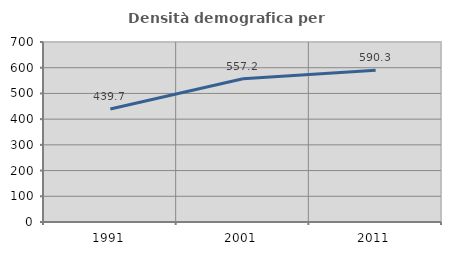
| Category | Densità demografica |
|---|---|
| 1991.0 | 439.715 |
| 2001.0 | 557.173 |
| 2011.0 | 590.302 |